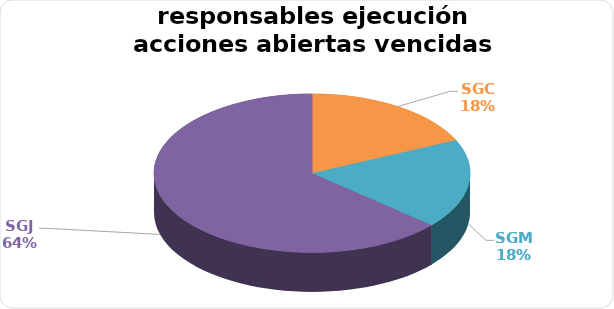
| Category | Series 0 |
|---|---|
| SGC | 2 |
| SGM | 2 |
| SGJ | 7 |